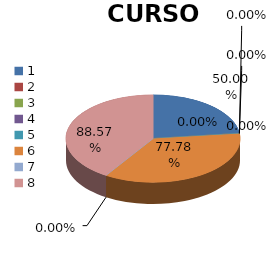
| Category | Series 0 |
|---|---|
| 0 | 0.5 |
| 1 | 0 |
| 2 | 0 |
| 3 | 0 |
| 4 | 0 |
| 5 | 0.778 |
| 6 | 0 |
| 7 | 0.886 |